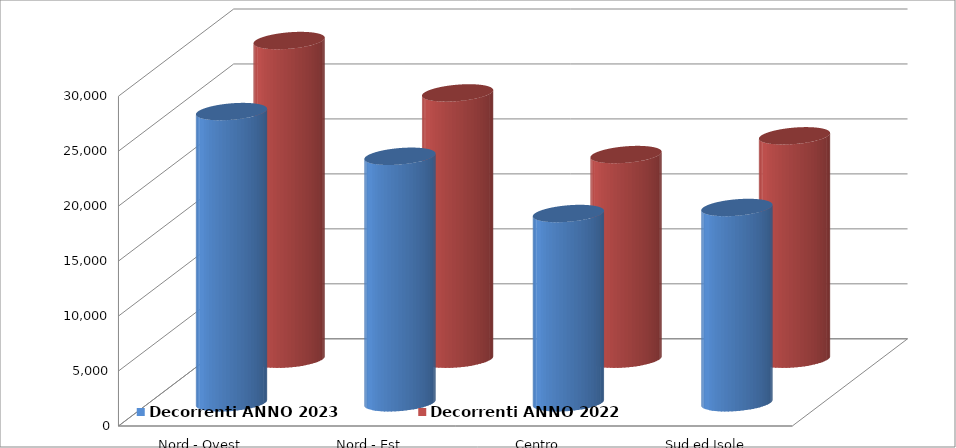
| Category | Decorrenti ANNO 2023 | Decorrenti ANNO 2022 |
|---|---|---|
| Nord - Ovest | 26491 | 28986 |
| Nord - Est | 22424 | 24222 |
| Centro | 17218 | 18614 |
| Sud ed Isole | 17767 | 20319 |